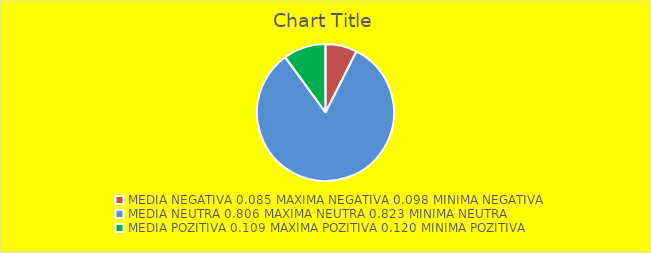
| Category | Series 0 |
|---|---|
| 0 | 0.072 |
| 1 | 0.798 |
| 2 | 0.097 |